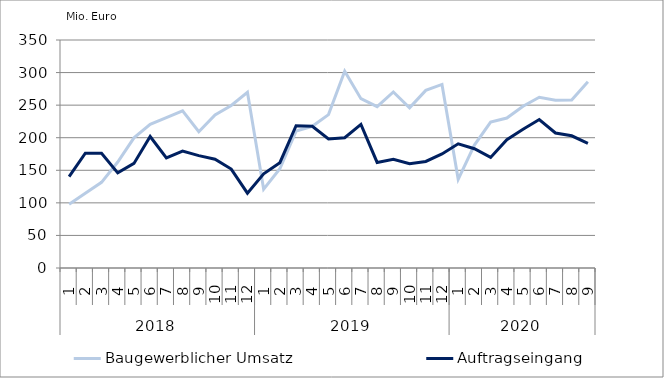
| Category | Baugewerblicher Umsatz | Auftragseingang |
|---|---|---|
| 0 | 97959.056 | 140119.385 |
| 1 | 114756.787 | 176330.213 |
| 2 | 131454.642 | 176241.061 |
| 3 | 162648.053 | 146063.407 |
| 4 | 199809.407 | 160551.931 |
| 5 | 220535.974 | 201835.846 |
| 6 | 230672.472 | 169132.23 |
| 7 | 241233.619 | 179396.293 |
| 8 | 209099.292 | 172542.764 |
| 9 | 234953.007 | 166991.729 |
| 10 | 249410.043 | 151835.629 |
| 11 | 269773.227 | 114807.456 |
| 12 | 120975.133 | 144510.881 |
| 13 | 152329.786 | 161685.201 |
| 14 | 210227.67 | 218455.879 |
| 15 | 217522.321 | 217610.064 |
| 16 | 235490.429 | 198110.439 |
| 17 | 301963.302 | 200012.086 |
| 18 | 259975.317 | 220559.061 |
| 19 | 247779.658 | 162059.723 |
| 20 | 270249.609 | 166829.611 |
| 21 | 245966.91 | 160120.773 |
| 22 | 272620.351 | 163589.389 |
| 23 | 281810.121 | 175051.247 |
| 24 | 136135.432 | 190647.086 |
| 25 | 188682.361 | 183141.14 |
| 26 | 224009.315 | 169770.009 |
| 27 | 230172.252 | 196979.845 |
| 28 | 248410.714 | 212955.83 |
| 29 | 262078.128 | 227853.487 |
| 30 | 257360.37 | 207209.188 |
| 31 | 257932.168 | 202976.091 |
| 32 | 285866.269 | 191463.844 |